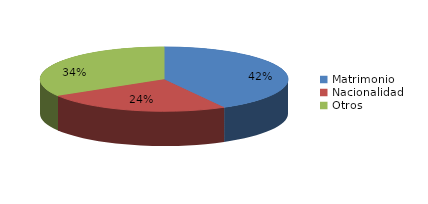
| Category | Series 0 |
|---|---|
| Matrimonio | 1274 |
| Nacionalidad | 740 |
| Otros | 1023 |